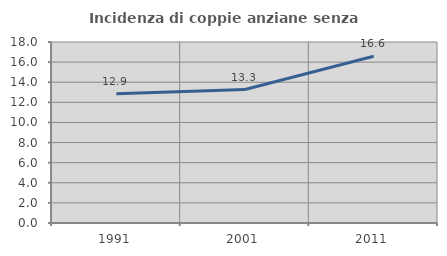
| Category | Incidenza di coppie anziane senza figli  |
|---|---|
| 1991.0 | 12.857 |
| 2001.0 | 13.272 |
| 2011.0 | 16.579 |